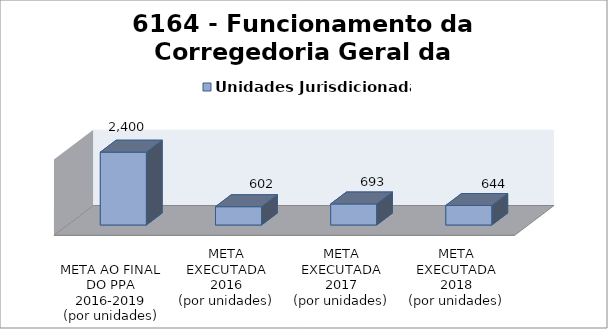
| Category | Unidades Jurisdicionadas |
|---|---|
| 
META AO FINAL
DO PPA
2016-2019
(por unidades)
 | 2400 |
| META EXECUTADA
2016
(por unidades) | 602 |
| META EXECUTADA
2017
(por unidades) | 693 |
| META EXECUTADA
2018
(por unidades) | 644 |